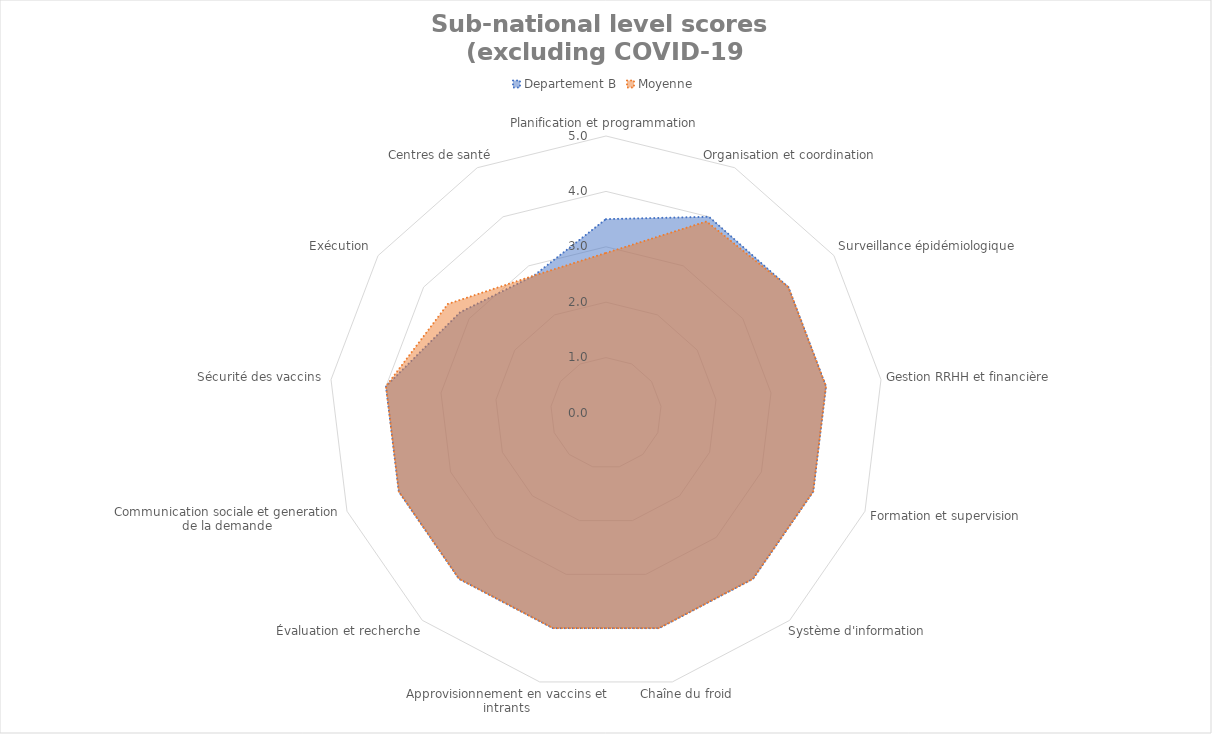
| Category | Departement B | Moyenne |
|---|---|---|
| Planification et programmation | 3.5 | 2.889 |
| Organisation et coordination | 4 | 3.905 |
| Surveillance épidémiologique | 4 | 4 |
| Gestion RRHH et financière | 4 | 4 |
| Formation et supervision | 4 | 4 |
| Système d'information | 4 | 4 |
| Chaîne du froid | 4 | 4 |
| Approvisionnement en vaccins et intrants | 4 | 4 |
| Évaluation et recherche | 4 | 4 |
| Communication sociale et generation de la demande | 4 | 4 |
| Sécurité des vaccins | 4 | 4 |
| Exécution | 3.2 | 3.467 |
| Centres de santé | 2.8 | 2.8 |